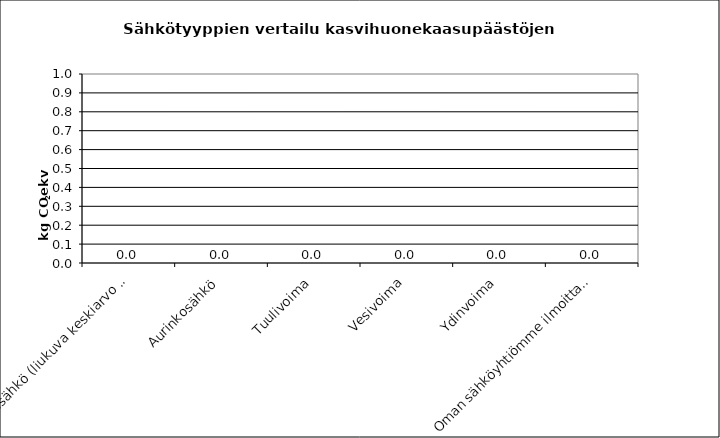
| Category | Sähkötyyppi |
|---|---|
| Yleissähkö (liukuva keskiarvo 2016-2018), Suomi, ei tuontia | 0 |
| Aurinkosähkö | 0 |
| Tuulivoima | 0 |
| Vesivoima | 0 |
| Ydinvoima | 0 |
| Oman sähköyhtiömme ilmoittama kerroin | 0 |